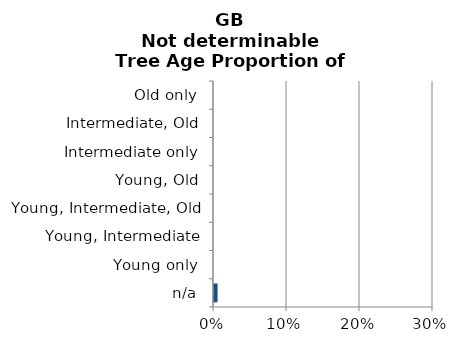
| Category | England | Scotland | Wales |
|---|---|---|---|
| n/a | 0.001 | 0.006 | 0 |
| Young only | 0 | 0 | 0 |
| Young, Intermediate | 0 | 0 | 0 |
| Young, Intermediate, Old | 0 | 0 | 0 |
| Young, Old | 0 | 0 | 0 |
| Intermediate only | 0 | 0 | 0 |
| Intermediate, Old | 0 | 0 | 0 |
| Old only | 0 | 0 | 0 |